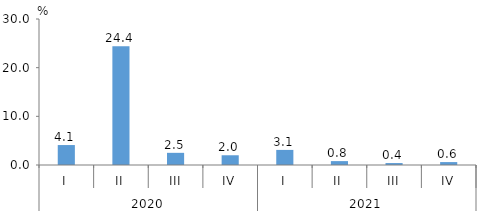
| Category | Series 0 |
|---|---|
| 0 | 4.1 |
| 1 | 24.4 |
| 2 | 2.5 |
| 3 | 2 |
| 4 | 3.1 |
| 5 | 0.8 |
| 6 | 0.4 |
| 7 | 0.6 |